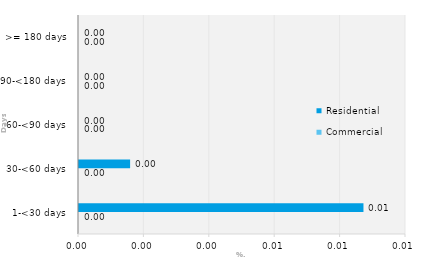
| Category | Commercial | Residential |
|---|---|---|
| 1-<30 days | 0 | 0.009 |
| 30-<60 days | 0 | 0.002 |
| 60-<90 days | 0 | 0 |
| 90-<180 days | 0 | 0 |
| >= 180 days | 0 | 0 |